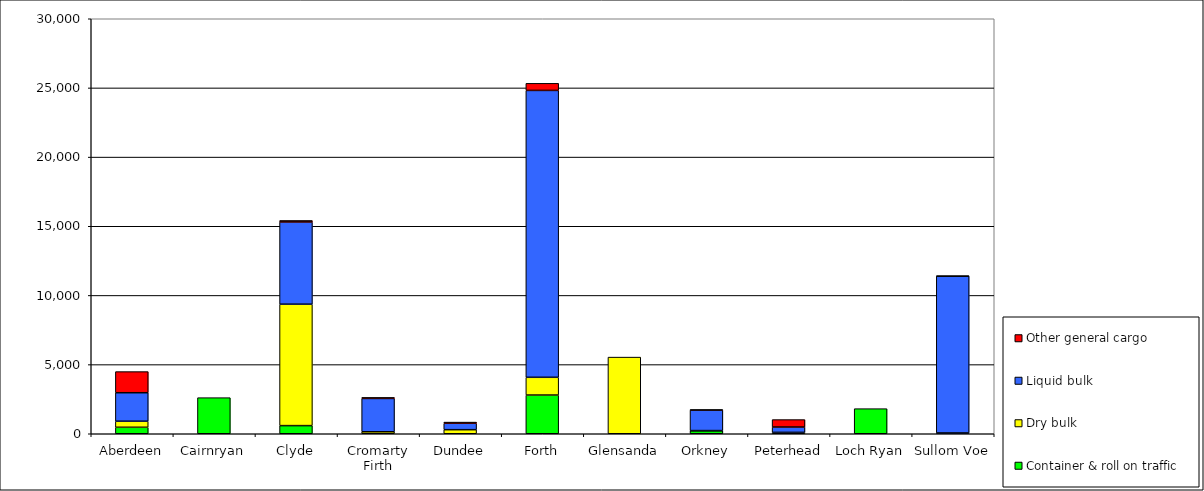
| Category | Container & roll on traffic | Dry bulk | Liquid bulk | Other general cargo |
|---|---|---|---|---|
| Aberdeen | 468 | 439 | 2059 | 1527 |
| Cairnryan | 2610 | 0 | 0 | 0 |
| Clyde | 588 | 8778 | 5945 | 109 |
| Cromarty Firth | 0 | 144 | 2408 | 76 |
| Dundee | 0 | 294 | 467 | 82 |
| Forth | 2798 | 1283 | 20739 | 512 |
| Glensanda | 0 | 5541 | 0 | 0 |
| Orkney | 215 | 15 | 1486 | 13 |
| Peterhead | 0 | 100 | 386 | 538 |
| Loch Ryan | 1815 | 0 | 0 | 0 |
| Sullom Voe | 0 | 57 | 11339 | 2 |